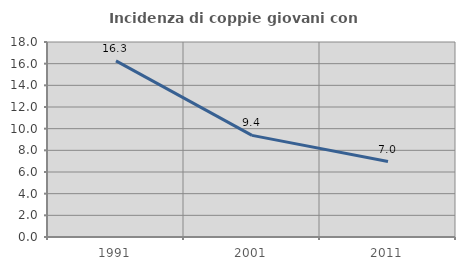
| Category | Incidenza di coppie giovani con figli |
|---|---|
| 1991.0 | 16.254 |
| 2001.0 | 9.38 |
| 2011.0 | 6.96 |